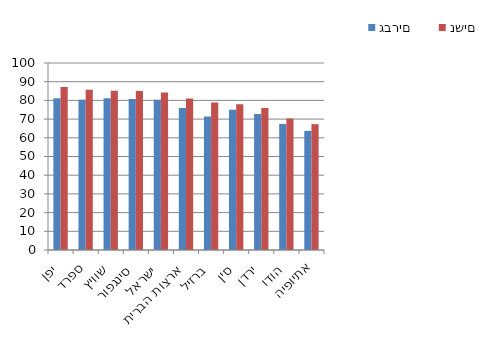
| Category | גברים | נשים |
|---|---|---|
| יפן | 81.1 | 87.1 |
| ספרד | 80.3 | 85.7 |
| שוויץ | 81.2 | 85.2 |
| סינגפור | 80.8 | 85 |
| ישראל | 80.3 | 84.2 |
| ארצות הברית | 76 | 81 |
| ברזיל | 71.4 | 78.9 |
| סין | 75 | 77.9 |
| ירדן | 72.7 | 76 |
| הודו | 67.4 | 70.3 |
| אתיופיה | 63.7 | 67.3 |